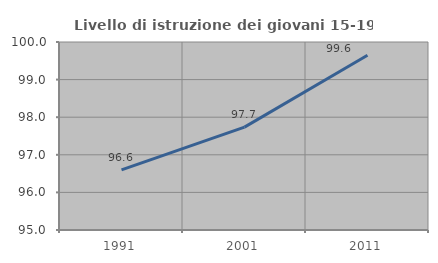
| Category | Livello di istruzione dei giovani 15-19 anni |
|---|---|
| 1991.0 | 96.601 |
| 2001.0 | 97.736 |
| 2011.0 | 99.649 |